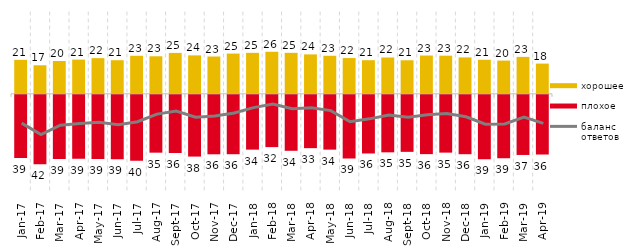
| Category | хорошее | плохое |
|---|---|---|
| 2017-01-01 | 20.75 | -38.65 |
| 2017-02-01 | 17.45 | -42.4 |
| 2017-03-01 | 20.05 | -39.25 |
| 2017-04-01 | 20.9 | -39 |
| 2017-05-01 | 21.8 | -39.15 |
| 2017-06-01 | 20.55 | -39.4 |
| 2017-07-01 | 23.25 | -40.3 |
| 2017-08-01 | 22.95 | -35.35 |
| 2017-09-01 | 25 | -35.55 |
| 2017-10-01 | 23.5 | -37.75 |
| 2017-11-01 | 22.8 | -36.35 |
| 2017-12-01 | 24.6 | -36.3 |
| 2018-01-01 | 25.05 | -33.5 |
| 2018-02-01 | 25.7 | -31.95 |
| 2018-03-01 | 25.05 | -34.2 |
| 2018-04-01 | 24.1 | -32.6 |
| 2018-05-01 | 23.25 | -33.5 |
| 2018-06-01 | 21.85 | -38.9 |
| 2018-07-01 | 20.55 | -35.85 |
| 2018-08-01 | 22.2 | -35.15 |
| 2018-09-01 | 20.5 | -34.85 |
| 2018-10-01 | 23.4 | -36.25 |
| 2018-11-01 | 23.303 | -35.329 |
| 2018-12-01 | 22.25 | -36.3 |
| 2019-01-01 | 20.8 | -39.35 |
| 2019-02-01 | 20.3 | -38.75 |
| 2019-03-01 | 22.576 | -36.748 |
| 2019-04-01 | 18.465 | -36.485 |